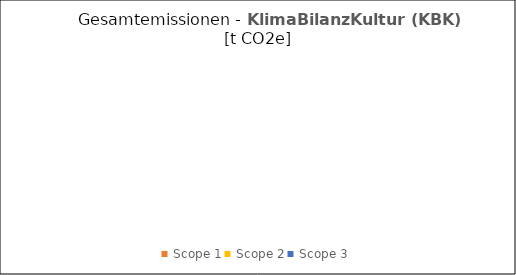
| Category | Gesamtemissionen [t CO2e] |
|---|---|
| Scope 1 | 0 |
| Scope 2 | 0 |
| Scope 3 | 0 |